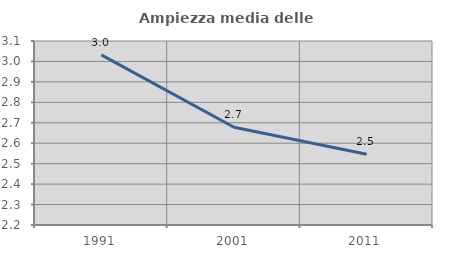
| Category | Ampiezza media delle famiglie |
|---|---|
| 1991.0 | 3.032 |
| 2001.0 | 2.678 |
| 2011.0 | 2.546 |